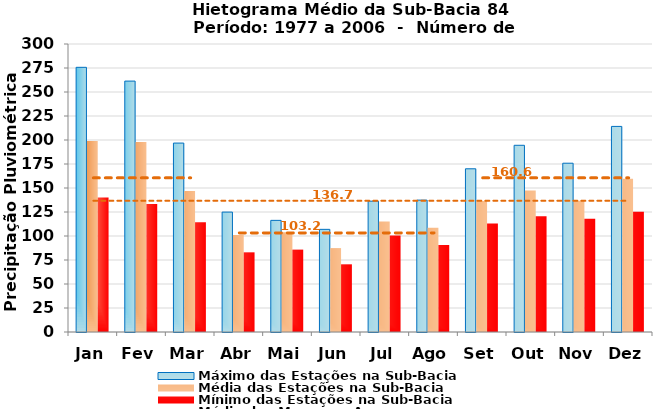
| Category | Máximo das Estações na Sub-Bacia | Média das Estações na Sub-Bacia | Mínimo das Estações na Sub-Bacia |
|---|---|---|---|
| Jan | 275.713 | 198.856 | 140.057 |
| Fev | 261.367 | 197.909 | 133.247 |
| Mar | 196.807 | 146.988 | 114.303 |
| Abr | 124.91 | 101.084 | 82.993 |
| Mai | 116.277 | 103.99 | 85.821 |
| Jun | 106.92 | 87.405 | 70.507 |
| Jul | 136.276 | 115.119 | 100.604 |
| Ago | 137.379 | 108.578 | 90.593 |
| Set | 170.013 | 136.566 | 113.124 |
| Out | 194.493 | 147.394 | 120.462 |
| Nov | 175.817 | 136.803 | 117.98 |
| Dez | 214.157 | 159.59 | 125.327 |